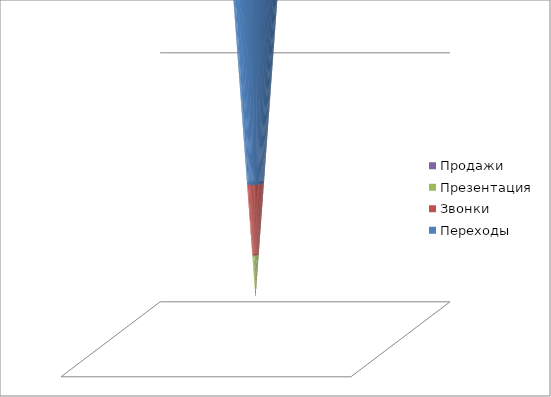
| Category | Переходы | Звонки | Презентация | Продажи |
|---|---|---|---|---|
| 0 | 1000 | 100 | 50 | 10 |